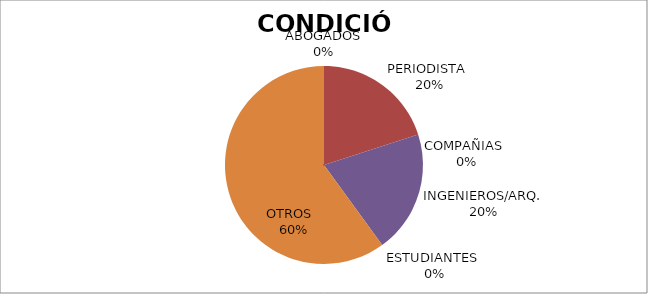
| Category | Series 0 |
|---|---|
| ABOGADOS | 0 |
| PERIODISTA  | 1 |
| COMPAÑIAS  | 0 |
| INGENIEROS/ARQ. | 1 |
| ESTUDIANTES  | 0 |
| OTROS   | 3 |